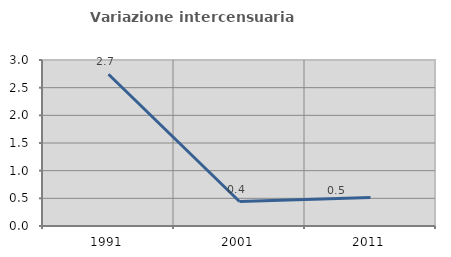
| Category | Variazione intercensuaria annua |
|---|---|
| 1991.0 | 2.743 |
| 2001.0 | 0.442 |
| 2011.0 | 0.517 |